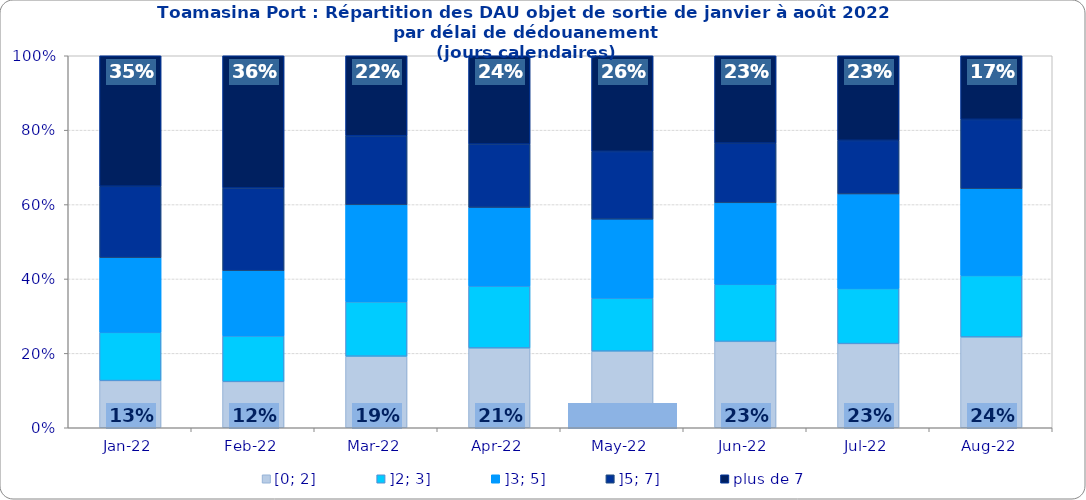
| Category | [0; 2] | ]2; 3] | ]3; 5] | ]5; 7] | plus de 7 |
|---|---|---|---|---|---|
| 2022-01-01 | 0.127 | 0.13 | 0.201 | 0.192 | 0.351 |
| 2022-02-01 | 0.124 | 0.123 | 0.175 | 0.222 | 0.356 |
| 2022-03-01 | 0.192 | 0.146 | 0.261 | 0.186 | 0.215 |
| 2022-04-01 | 0.214 | 0.166 | 0.211 | 0.17 | 0.237 |
| 2022-05-01 | 0.206 | 0.143 | 0.212 | 0.182 | 0.257 |
| 2022-06-01 | 0.232 | 0.153 | 0.219 | 0.16 | 0.235 |
| 2022-07-01 | 0.226 | 0.148 | 0.254 | 0.144 | 0.228 |
| 2022-08-01 | 0.244 | 0.165 | 0.233 | 0.186 | 0.171 |